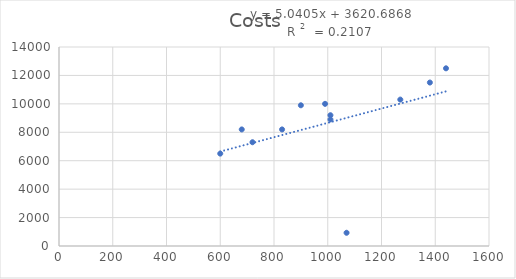
| Category | Costs |
|---|---|
| 600.0 | 6500 |
| 680.0 | 8200 |
| 720.0 | 7300 |
| 1010.0 | 8900 |
| 900.0 | 9900 |
| 990.0 | 10000 |
| 1270.0 | 10300 |
| 1440.0 | 12500 |
| 1380.0 | 11500 |
| 1010.0 | 9200 |
| 830.0 | 8200 |
| 1070.0 | 930 |